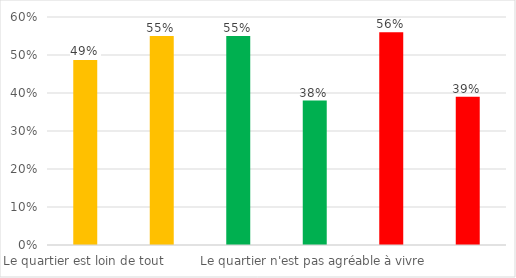
| Category | Series 0 |
|---|---|
| Le quartier est loin de tout | 0.49 |
| Le quartier n'est pas loin de tout | 0.55 |
| Le quartier est agréable à vivre | 0.55 |
| Le quartier n'est pas agréable à vivre | 0.38 |
| Le quartier est sûr | 0.56 |
| Le quartier n'est pas sûr | 0.39 |